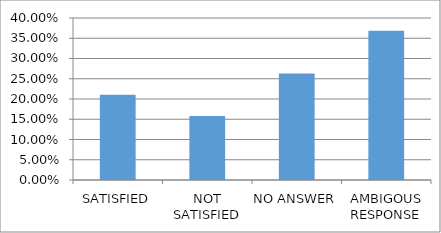
| Category | Series 0 |
|---|---|
| SATISFIED | 0.211 |
| NOT SATISFIED | 0.158 |
| NO ANSWER | 0.263 |
| AMBIGOUS RESPONSE | 0.368 |